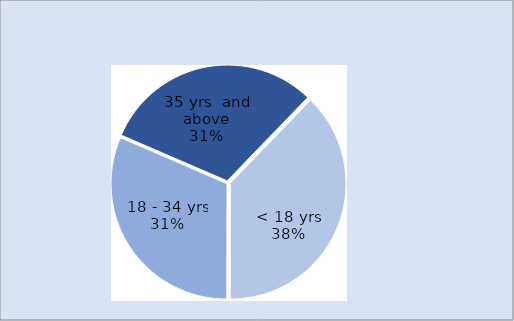
| Category | Series 0 |
|---|---|
| < 18 yrs | 689 |
| 18 - 34 yrs | 573 |
| 35 yrs  and above | 560 |